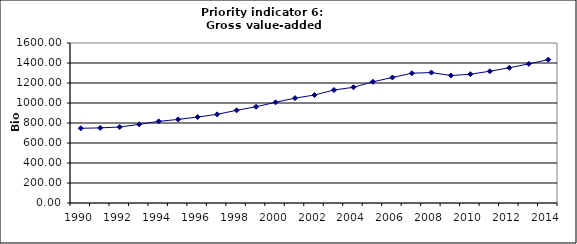
| Category | Gross value-added services, Bio Euro (EC95) |
|---|---|
| 1990 | 747.33 |
| 1991 | 751.2 |
| 1992 | 759.776 |
| 1993 | 786.688 |
| 1994 | 816.149 |
| 1995 | 835.732 |
| 1996 | 859.578 |
| 1997 | 886.434 |
| 1998 | 926.852 |
| 1999 | 962.459 |
| 2000 | 1006.934 |
| 2001 | 1048.828 |
| 2002 | 1079.815 |
| 2003 | 1130.08 |
| 2004 | 1157.129 |
| 2005 | 1212.118 |
| 2006 | 1255.364 |
| 2007 | 1297.72 |
| 2008 | 1304.432 |
| 2009 | 1274.683 |
| 2010 | 1288.158 |
| 2011 | 1317.587 |
| 2012 | 1352.445 |
| 2013 | 1391.342 |
| 2014 | 1434.053 |